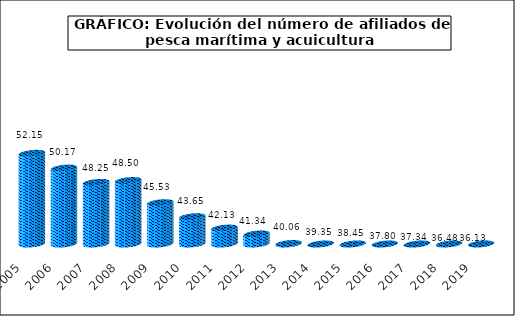
| Category | Series1 |
|---|---|
| 2005.0 | 52.15 |
| 2006.0 | 50.17 |
| 2007.0 | 48.25 |
| 2008.0 | 48.5 |
| 2009.0 | 45.53 |
| 2010.0 | 43.65 |
| 2011.0 | 42.13 |
| 2012.0 | 41.34 |
| 2013.0 | 40.06 |
| 2014.0 | 39.35 |
| 2015.0 | 38.45 |
| 2016.0 | 37.8 |
| 2017.0 | 37.34 |
| 2018.0 | 36.48 |
| 2019.0 | 36.132 |